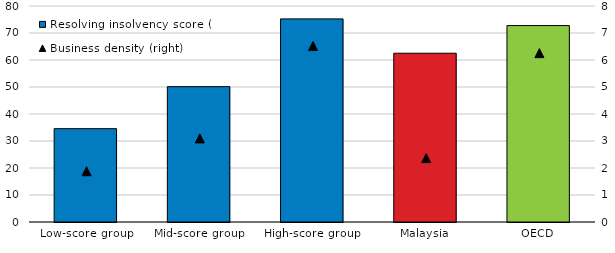
| Category | Resolving insolvency score (left) |
|---|---|
| Low-score group | 34.57 |
| Mid-score group | 50.132 |
| High-score group | 75.229 |
| Malaysia | 62.51 |
| OECD | 72.749 |